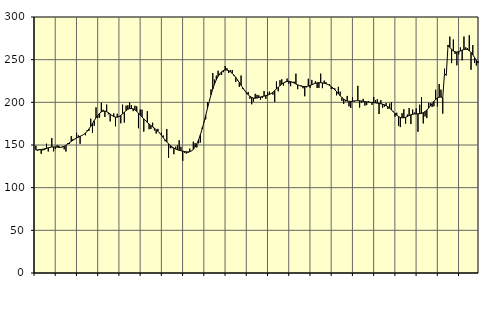
| Category | Piggar | Series 1 |
|---|---|---|
| nan | 149.1 | 144.2 |
| 1.0 | 143.1 | 144.2 |
| 1.0 | 145.3 | 144.4 |
| 1.0 | 139.7 | 144.72 |
| 1.0 | 143.7 | 145.1 |
| 1.0 | 144.1 | 145.56 |
| 1.0 | 151.5 | 146.1 |
| 1.0 | 142.4 | 146.74 |
| 1.0 | 147 | 147.3 |
| 1.0 | 158.2 | 147.66 |
| 1.0 | 142.6 | 147.77 |
| 1.0 | 145.2 | 147.68 |
| nan | 149.8 | 147.46 |
| 2.0 | 149.3 | 147.24 |
| 2.0 | 147 | 147.25 |
| 2.0 | 148.5 | 147.62 |
| 2.0 | 144.9 | 148.42 |
| 2.0 | 142.3 | 149.6 |
| 2.0 | 152.1 | 151.05 |
| 2.0 | 151.3 | 152.65 |
| 2.0 | 160.4 | 154.23 |
| 2.0 | 157.1 | 155.7 |
| 2.0 | 156.8 | 157.04 |
| 2.0 | 164.3 | 158.21 |
| nan | 161.3 | 159.2 |
| 3.0 | 151.4 | 160.14 |
| 3.0 | 161.2 | 161.12 |
| 3.0 | 162.5 | 162.33 |
| 3.0 | 161.4 | 163.97 |
| 3.0 | 167.3 | 166.14 |
| 3.0 | 166.6 | 168.78 |
| 3.0 | 180.9 | 171.86 |
| 3.0 | 164.3 | 175.22 |
| 3.0 | 172.4 | 178.63 |
| 3.0 | 194.1 | 181.92 |
| 3.0 | 181.7 | 184.84 |
| nan | 182 | 187.16 |
| 4.0 | 199.6 | 188.81 |
| 4.0 | 191.2 | 189.66 |
| 4.0 | 182.8 | 189.71 |
| 4.0 | 197.4 | 189.04 |
| 4.0 | 186 | 187.8 |
| 4.0 | 177.7 | 186.24 |
| 4.0 | 184.7 | 184.66 |
| 4.0 | 187.1 | 183.38 |
| 4.0 | 171.9 | 182.69 |
| 4.0 | 186.6 | 182.64 |
| 4.0 | 182.8 | 183.33 |
| nan | 175.4 | 184.71 |
| 5.0 | 197.3 | 186.5 |
| 5.0 | 176.3 | 188.46 |
| 5.0 | 196.1 | 190.36 |
| 5.0 | 196.6 | 191.83 |
| 5.0 | 199.8 | 192.67 |
| 5.0 | 196.7 | 192.83 |
| 5.0 | 189.7 | 192.31 |
| 5.0 | 196 | 191.13 |
| 5.0 | 195.3 | 189.45 |
| 5.0 | 169.6 | 187.43 |
| 5.0 | 191.7 | 185.19 |
| nan | 191.4 | 182.88 |
| 6.0 | 165.7 | 180.61 |
| 6.0 | 179.1 | 178.46 |
| 6.0 | 189.6 | 176.44 |
| 6.0 | 168.5 | 174.57 |
| 6.0 | 168.8 | 172.86 |
| 6.0 | 176.1 | 171.27 |
| 6.0 | 167 | 169.69 |
| 6.0 | 163.4 | 168.01 |
| 6.0 | 168.9 | 166.08 |
| 6.0 | 164.3 | 163.85 |
| 6.0 | 164.4 | 161.34 |
| nan | 161.1 | 158.66 |
| 7.0 | 154.4 | 156.01 |
| 7.0 | 168.7 | 153.55 |
| 7.0 | 135.1 | 151.31 |
| 7.0 | 146.2 | 149.32 |
| 7.0 | 146.3 | 147.69 |
| 7.0 | 139.2 | 146.37 |
| 7.0 | 148 | 145.29 |
| 7.0 | 149.6 | 144.45 |
| 7.0 | 155.5 | 143.79 |
| 7.0 | 147.9 | 143.27 |
| 7.0 | 131.3 | 142.8 |
| nan | 140.8 | 142.36 |
| 8.0 | 140 | 142.01 |
| 8.0 | 140.7 | 141.87 |
| 8.0 | 145.7 | 142.13 |
| 8.0 | 143.3 | 143.07 |
| 8.0 | 153.9 | 144.85 |
| 8.0 | 152.2 | 147.62 |
| 8.0 | 147.1 | 151.45 |
| 8.0 | 152 | 156.29 |
| 8.0 | 153 | 162.12 |
| 8.0 | 170.4 | 168.87 |
| 8.0 | 177.2 | 176.46 |
| nan | 180 | 184.62 |
| 9.0 | 200.1 | 192.95 |
| 9.0 | 201.1 | 201.11 |
| 9.0 | 215.2 | 208.76 |
| 9.0 | 234.3 | 215.61 |
| 9.0 | 226.7 | 221.53 |
| 9.0 | 231.3 | 226.45 |
| 9.0 | 237 | 230.43 |
| 9.0 | 232.1 | 233.56 |
| 9.0 | 232.2 | 235.83 |
| 9.0 | 235.4 | 237.27 |
| 9.0 | 242.5 | 237.91 |
| nan | 240.1 | 237.85 |
| 10.0 | 234.4 | 237.13 |
| 10.0 | 237.6 | 235.79 |
| 10.0 | 237.8 | 233.98 |
| 10.0 | 230.8 | 231.78 |
| 10.0 | 223.9 | 229.23 |
| 10.0 | 225.6 | 226.34 |
| 10.0 | 218.2 | 223.2 |
| 10.0 | 231.4 | 219.97 |
| 10.0 | 215.6 | 216.82 |
| 10.0 | 213.3 | 213.85 |
| 10.0 | 210.1 | 211.18 |
| nan | 212.2 | 208.89 |
| 11.0 | 204.3 | 207.07 |
| 11.0 | 197.7 | 205.77 |
| 11.0 | 200.7 | 205 |
| 11.0 | 210 | 204.81 |
| 11.0 | 208.8 | 205.05 |
| 11.0 | 208.2 | 205.61 |
| 11.0 | 203 | 206.25 |
| 11.0 | 205 | 206.84 |
| 11.0 | 213.2 | 207.33 |
| 11.0 | 204 | 207.82 |
| 11.0 | 211.6 | 208.41 |
| nan | 212.5 | 209.21 |
| 12.0 | 210.7 | 210.33 |
| 12.0 | 209 | 211.86 |
| 12.0 | 200.3 | 213.72 |
| 12.0 | 224.5 | 215.71 |
| 12.0 | 212.9 | 217.68 |
| 12.0 | 225.9 | 219.56 |
| 12.0 | 227 | 221.26 |
| 12.0 | 219.6 | 222.69 |
| 12.0 | 224.2 | 223.78 |
| 12.0 | 227.9 | 224.45 |
| 12.0 | 221.8 | 224.62 |
| nan | 218.9 | 224.3 |
| 13.0 | 222.8 | 223.58 |
| 13.0 | 224.3 | 222.6 |
| 13.0 | 233.6 | 221.53 |
| 13.0 | 215.4 | 220.52 |
| 13.0 | 219.5 | 219.66 |
| 13.0 | 219.9 | 219 |
| 13.0 | 216.5 | 218.58 |
| 13.0 | 207.1 | 218.45 |
| 13.0 | 217.5 | 218.63 |
| 13.0 | 227.6 | 219.09 |
| 13.0 | 217 | 219.76 |
| nan | 226.3 | 220.6 |
| 14.0 | 221.5 | 221.5 |
| 14.0 | 224.6 | 222.27 |
| 14.0 | 216.8 | 222.83 |
| 14.0 | 216.9 | 223.08 |
| 14.0 | 233.6 | 223.06 |
| 14.0 | 216.6 | 222.78 |
| 14.0 | 225.5 | 222.34 |
| 14.0 | 223.7 | 221.76 |
| 14.0 | 220.7 | 220.96 |
| 14.0 | 221.5 | 219.86 |
| 14.0 | 215.5 | 218.46 |
| nan | 215.5 | 216.74 |
| 15.0 | 216.4 | 214.73 |
| 15.0 | 208.2 | 212.52 |
| 15.0 | 218.2 | 210.14 |
| 15.0 | 212.5 | 207.8 |
| 15.0 | 201.7 | 205.64 |
| 15.0 | 198.2 | 203.79 |
| 15.0 | 201 | 202.41 |
| 15.0 | 207.5 | 201.52 |
| 15.0 | 195.3 | 201.1 |
| 15.0 | 193.4 | 201.06 |
| 15.0 | 206.2 | 201.3 |
| nan | 200.4 | 201.63 |
| 16.0 | 201.9 | 201.88 |
| 16.0 | 219.3 | 201.94 |
| 16.0 | 193.9 | 201.83 |
| 16.0 | 199.4 | 201.53 |
| 16.0 | 204 | 201.17 |
| 16.0 | 196.1 | 200.82 |
| 16.0 | 196.8 | 200.51 |
| 16.0 | 201.5 | 200.24 |
| 16.0 | 200.1 | 200.02 |
| 16.0 | 197 | 199.82 |
| 16.0 | 206.3 | 199.62 |
| nan | 202.7 | 199.37 |
| 17.0 | 203.7 | 199.06 |
| 17.0 | 186.3 | 198.7 |
| 17.0 | 202.6 | 198.3 |
| 17.0 | 193.6 | 197.85 |
| 17.0 | 194.9 | 197.14 |
| 17.0 | 199.1 | 196.13 |
| 17.0 | 192.2 | 194.81 |
| 17.0 | 198.6 | 193.12 |
| 17.0 | 200.4 | 191.18 |
| 17.0 | 189.8 | 189.07 |
| 17.0 | 183.2 | 186.95 |
| nan | 187.8 | 184.93 |
| 18.0 | 172.5 | 183.36 |
| 18.0 | 171 | 182.35 |
| 18.0 | 187.3 | 181.88 |
| 18.0 | 192 | 181.94 |
| 18.0 | 175 | 182.51 |
| 18.0 | 185.7 | 183.45 |
| 18.0 | 193.2 | 184.5 |
| 18.0 | 174.5 | 185.41 |
| 18.0 | 191.5 | 186.02 |
| 18.0 | 188 | 186.35 |
| 18.0 | 192.9 | 186.47 |
| nan | 165.5 | 186.55 |
| 19.0 | 197.3 | 186.7 |
| 19.0 | 206 | 187.08 |
| 19.0 | 175.3 | 187.89 |
| 19.0 | 183.5 | 189.16 |
| 19.0 | 181.5 | 190.95 |
| 19.0 | 199.4 | 193.25 |
| 19.0 | 199 | 195.8 |
| 19.0 | 194.5 | 198.52 |
| 19.0 | 195.4 | 201.13 |
| 19.0 | 214.8 | 203.34 |
| 19.0 | 195.2 | 205.04 |
| nan | 221.5 | 206.05 |
| 20.0 | 214.9 | 206.22 |
| 20.0 | 186.8 | 205.43 |
| 20.0 | 239.4 | 233.89 |
| 20.0 | 232 | 231.64 |
| 20.0 | 265.5 | 267.18 |
| 20.0 | 277 | 264.46 |
| 20.0 | 246 | 262.03 |
| 20.0 | 273.6 | 260.2 |
| 20.0 | 256.8 | 259.16 |
| 20.0 | 243.4 | 258.96 |
| 20.0 | 256.3 | 259.39 |
| nan | 264.4 | 260.24 |
| 21.0 | 249.2 | 261.16 |
| 21.0 | 277.1 | 261.9 |
| 21.0 | 264.5 | 262.23 |
| 21.0 | 263.6 | 261.81 |
| 21.0 | 278.6 | 260.54 |
| 21.0 | 238.2 | 258.44 |
| 21.0 | 267.1 | 255.66 |
| 21.0 | 246.1 | 252.5 |
| 21.0 | 243.1 | 249.2 |
| 21.0 | 247.9 | 246.13 |